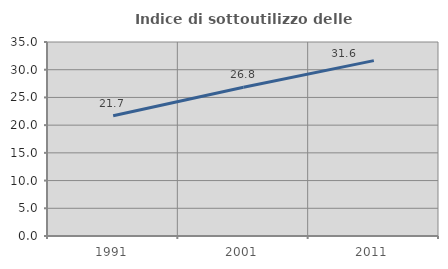
| Category | Indice di sottoutilizzo delle abitazioni  |
|---|---|
| 1991.0 | 21.69 |
| 2001.0 | 26.842 |
| 2011.0 | 31.635 |